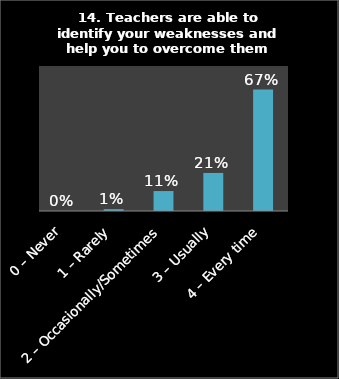
| Category | Series 0 |
|---|---|
| 0 – Never | 0 |
| 1 – Rarely | 0.01 |
| 2 – Occasionally/Sometimes | 0.11 |
| 3 – Usually | 0.21 |
| 4 – Every time | 0.67 |